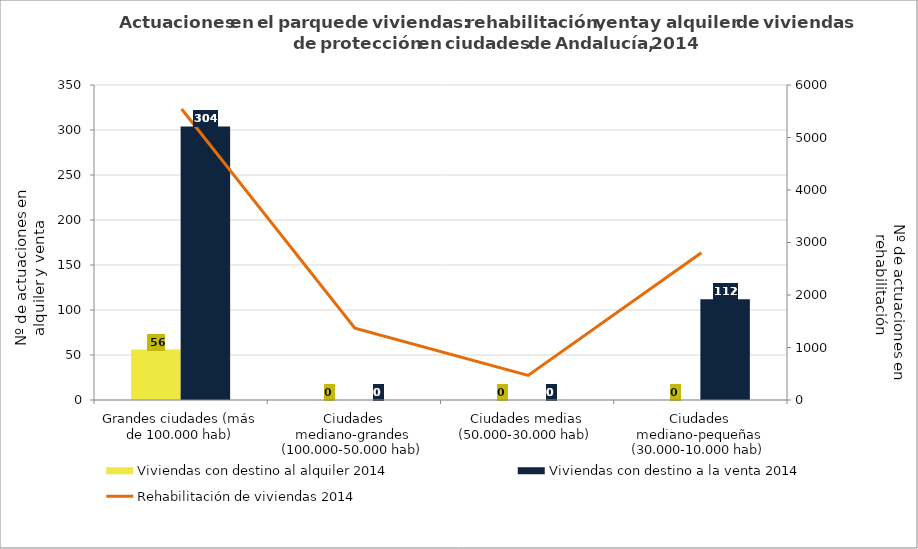
| Category | Viviendas con destino al alquiler 2014 | Viviendas con destino a la venta 2014 |
|---|---|---|
| Grandes ciudades (más de 100.000 hab) | 56 | 304 |
| Ciudades mediano-grandes (100.000-50.000 hab) | 0 | 0 |
| Ciudades medias (50.000-30.000 hab) | 0 | 0 |
| Ciudades mediano-pequeñas (30.000-10.000 hab) | 0 | 112 |